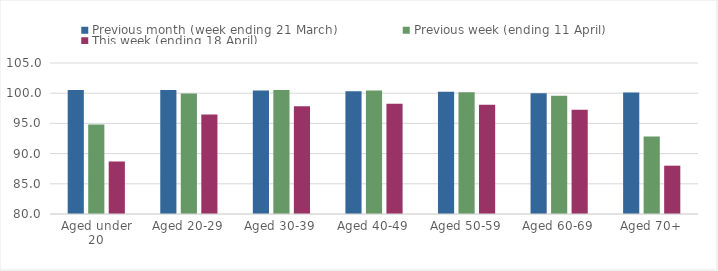
| Category | Previous month (week ending 21 March) | Previous week (ending 11 April) | This week (ending 18 April) |
|---|---|---|---|
| Aged under 20 | 100.544 | 94.834 | 88.679 |
| Aged 20-29 | 100.511 | 99.946 | 96.484 |
| Aged 30-39 | 100.428 | 100.511 | 97.82 |
| Aged 40-49 | 100.321 | 100.446 | 98.249 |
| Aged 50-59 | 100.227 | 100.168 | 98.073 |
| Aged 60-69 | 99.984 | 99.584 | 97.278 |
| Aged 70+ | 100.099 | 92.839 | 88 |